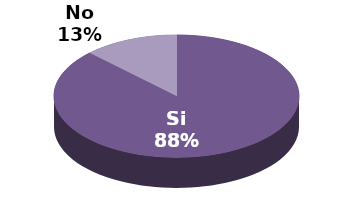
| Category | Series 1 |
|---|---|
| Si | 7 |
| No | 1 |